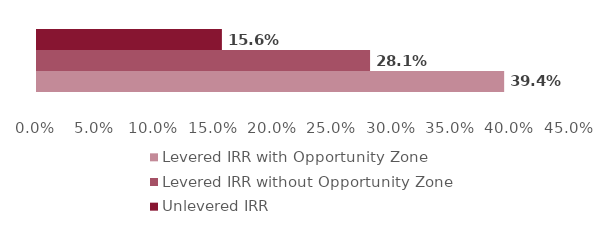
| Category | Levered IRR with Opportunity Zone | Levered IRR without Opportunity Zone | Unlevered IRR |
|---|---|---|---|
| 0 | 0.394 | 0.281 | 0.156 |